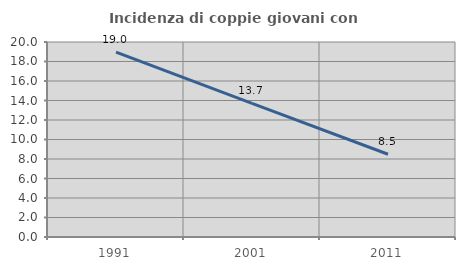
| Category | Incidenza di coppie giovani con figli |
|---|---|
| 1991.0 | 18.964 |
| 2001.0 | 13.712 |
| 2011.0 | 8.489 |